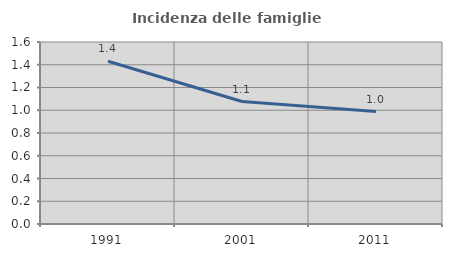
| Category | Incidenza delle famiglie numerose |
|---|---|
| 1991.0 | 1.431 |
| 2001.0 | 1.077 |
| 2011.0 | 0.988 |